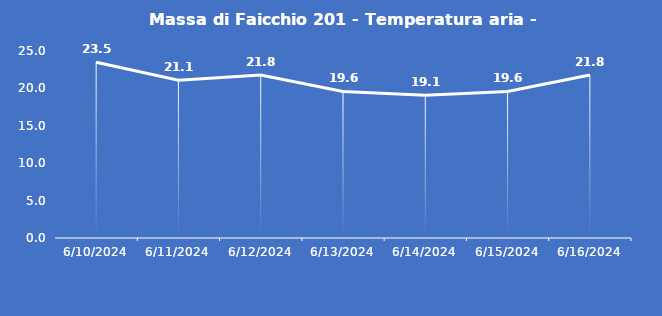
| Category | Massa di Faicchio 201 - Temperatura aria - Grezzo (°C) |
|---|---|
| 6/10/24 | 23.5 |
| 6/11/24 | 21.1 |
| 6/12/24 | 21.8 |
| 6/13/24 | 19.6 |
| 6/14/24 | 19.1 |
| 6/15/24 | 19.6 |
| 6/16/24 | 21.8 |